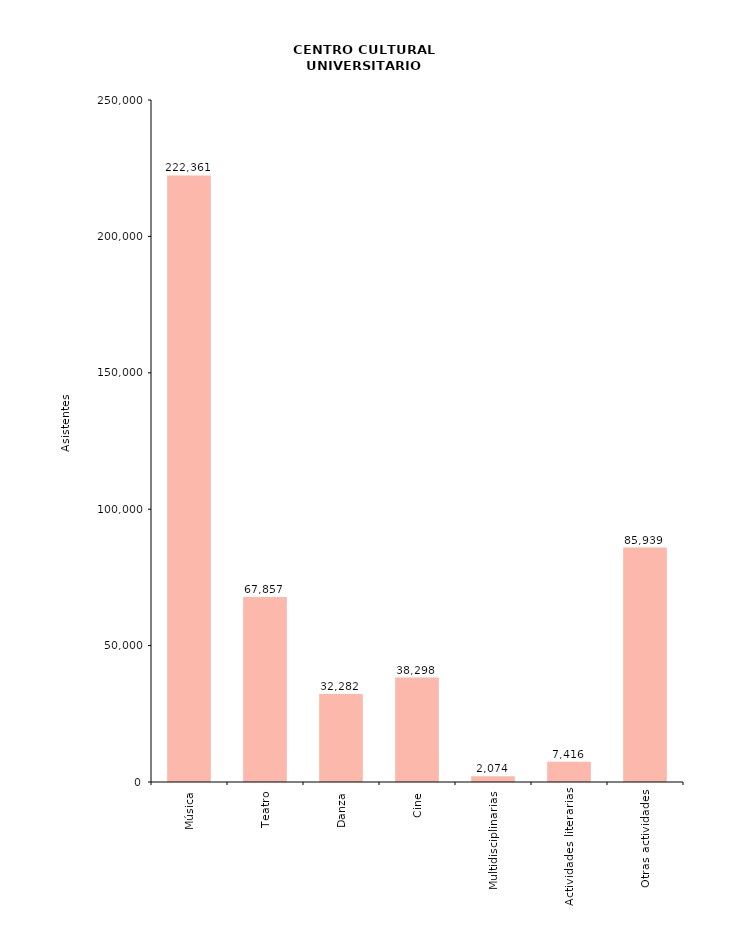
| Category | Series 0 |
|---|---|
| Música | 222361 |
| Teatro | 67857 |
| Danza | 32282 |
| Cine | 38298 |
| Multidisciplinarias | 2074 |
| Actividades literarias | 7416 |
| Otras actividades | 85939 |